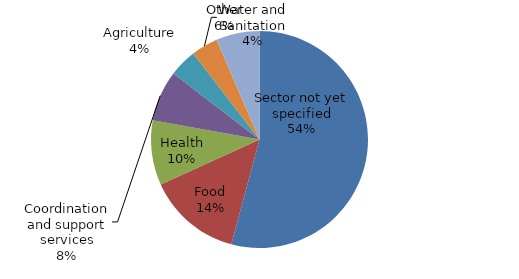
| Category | Series 0 |
|---|---|
| Sector not yet specified | 138501919 |
| Food | 35856677 |
| Health | 24574820 |
| Coordination and support services | 19407692 |
| Agriculture | 10545178 |
| Water and Sanitation | 10174950 |
| Other | 16547895 |